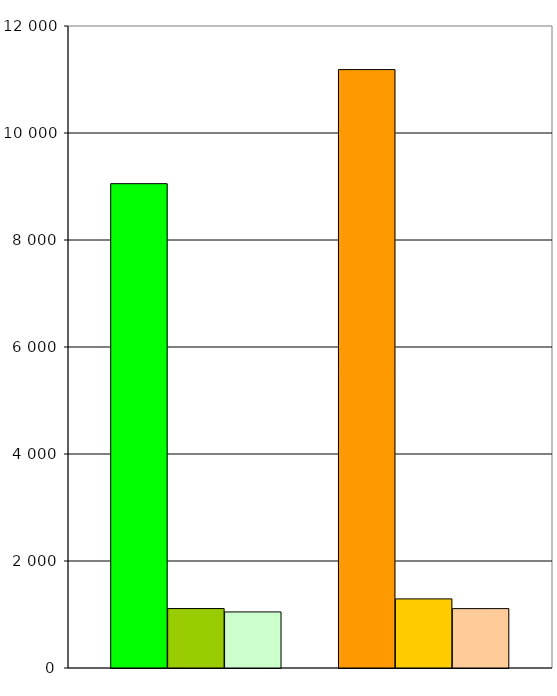
| Category | Series 0 | Series 1 | Series 2 | Series 3 | Series 4 | Series 5 | Series 6 |
|---|---|---|---|---|---|---|---|
| 0 | 9053 | 1111 | 1048 |  | 11185 | 1292 | 1110 |